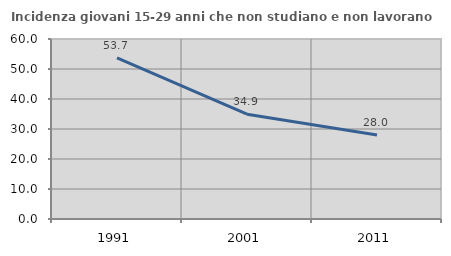
| Category | Incidenza giovani 15-29 anni che non studiano e non lavorano  |
|---|---|
| 1991.0 | 53.718 |
| 2001.0 | 34.937 |
| 2011.0 | 28.01 |